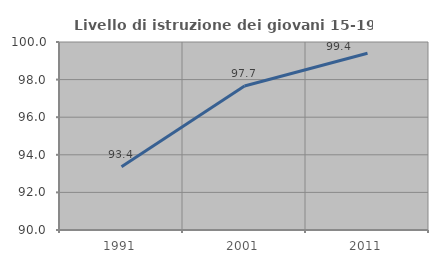
| Category | Livello di istruzione dei giovani 15-19 anni |
|---|---|
| 1991.0 | 93.365 |
| 2001.0 | 97.661 |
| 2011.0 | 99.405 |